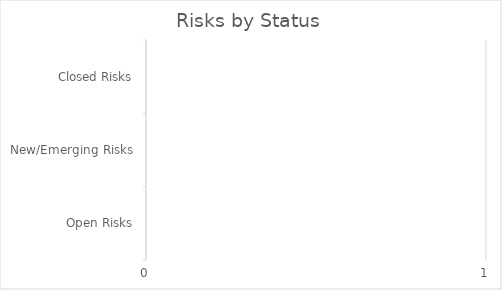
| Category | Open Risks |
|---|---|
| Open Risks | 0 |
| New/Emerging Risks | 0 |
| Closed Risks | 0 |